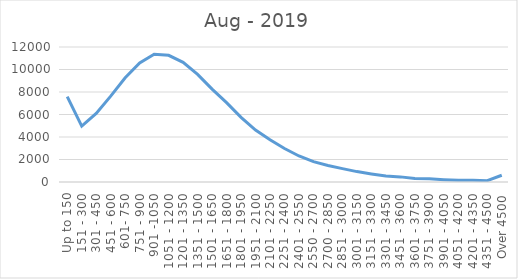
| Category | Aug - 2019 |
|---|---|
| Up to 150 | 7586 |
| 151 - 300 | 4972 |
| 301 - 450 | 6100 |
| 451 - 600 | 7631 |
| 601- 750 | 9260 |
| 751 - 900 | 10582 |
| 901 -1050 | 11356 |
| 1051 - 1200 | 11259 |
| 1201 - 1350 | 10632 |
| 1351 - 1500 | 9563 |
| 1501 - 1650 | 8252 |
| 1651 - 1800 | 7060 |
| 1801 - 1950 | 5751 |
| 1951 - 2100 | 4612 |
| 2101 - 2250 | 3748 |
| 2251 - 2400 | 2977 |
| 2401 - 2550 | 2313 |
| 2550 - 2700 | 1811 |
| 2700 - 2850 | 1470 |
| 2851 - 3000 | 1188 |
| 3001 - 3150 | 924 |
| 3151 - 3300 | 717 |
| 3301 - 3450 | 536 |
| 3451 - 3600 | 455 |
| 3601 - 3750 | 315 |
| 3751 - 3900 | 283 |
| 3901 - 4050 | 208 |
| 4051 - 4200 | 155 |
| 4201 - 4350 | 153 |
| 4351 - 4500 | 122 |
| Over 4500 | 601 |